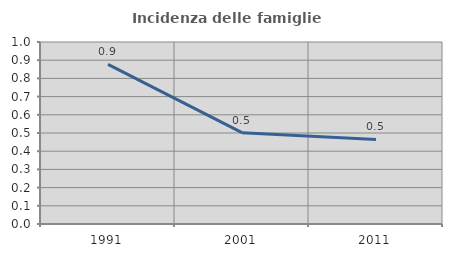
| Category | Incidenza delle famiglie numerose |
|---|---|
| 1991.0 | 0.877 |
| 2001.0 | 0.502 |
| 2011.0 | 0.464 |